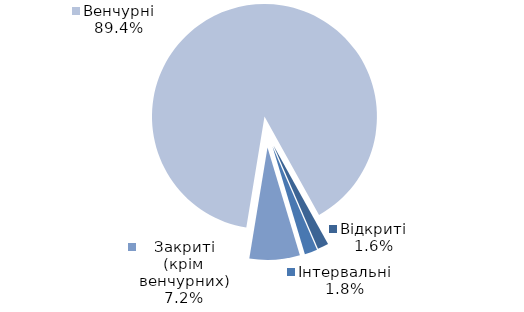
| Category | Series 0 |
|---|---|
| Відкриті | 19 |
| Інтервальні | 22 |
| Закриті (крім венчурних) | 87 |
| Венчурні | 1075 |